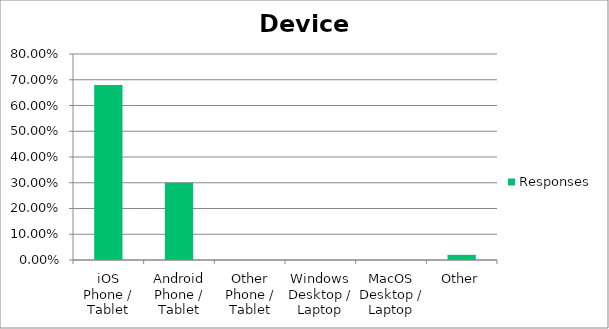
| Category | Responses |
|---|---|
| iOS Phone / Tablet | 0.68 |
| Android Phone / Tablet | 0.3 |
| Other Phone / Tablet | 0 |
| Windows Desktop / Laptop | 0 |
| MacOS Desktop / Laptop | 0 |
| Other | 0.02 |